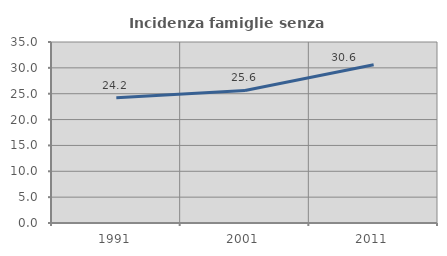
| Category | Incidenza famiglie senza nuclei |
|---|---|
| 1991.0 | 24.231 |
| 2001.0 | 25.626 |
| 2011.0 | 30.606 |